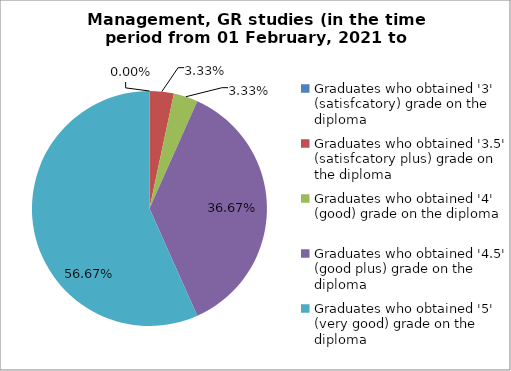
| Category | Series 0 |
|---|---|
| Graduates who obtained '3' (satisfcatory) grade on the diploma  | 0 |
| Graduates who obtained '3.5' (satisfcatory plus) grade on the diploma  | 3.333 |
| Graduates who obtained '4' (good) grade on the diploma  | 3.333 |
| Graduates who obtained '4.5' (good plus) grade on the diploma  | 36.667 |
| Graduates who obtained '5' (very good) grade on the diploma  | 56.667 |